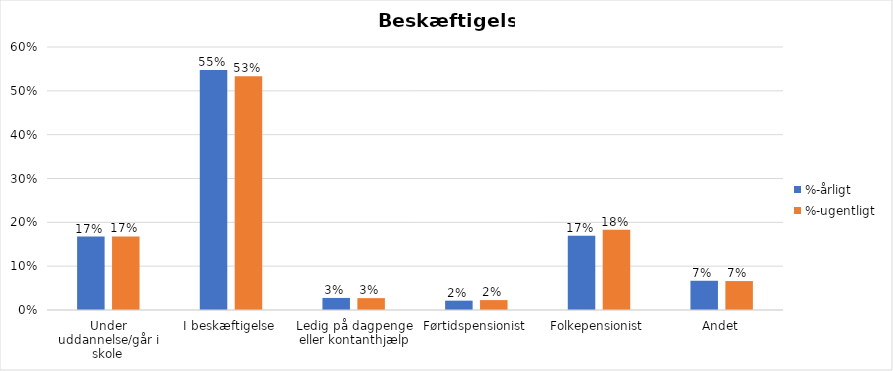
| Category | %-årligt | %-ugentligt |
|---|---|---|
| Under uddannelse/går i skole | 0.168 | 0.168 |
| I beskæftigelse | 0.547 | 0.533 |
| Ledig på dagpenge eller kontanthjælp | 0.028 | 0.027 |
| Førtidspensionist | 0.021 | 0.023 |
| Folkepensionist | 0.169 | 0.183 |
| Andet | 0.067 | 0.066 |